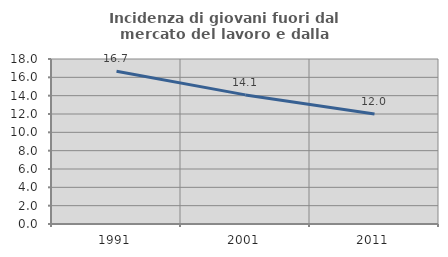
| Category | Incidenza di giovani fuori dal mercato del lavoro e dalla formazione  |
|---|---|
| 1991.0 | 16.667 |
| 2001.0 | 14.085 |
| 2011.0 | 12 |